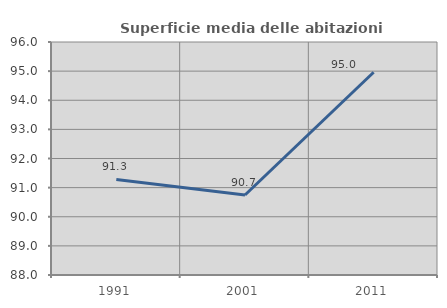
| Category | Superficie media delle abitazioni occupate |
|---|---|
| 1991.0 | 91.279 |
| 2001.0 | 90.746 |
| 2011.0 | 94.961 |